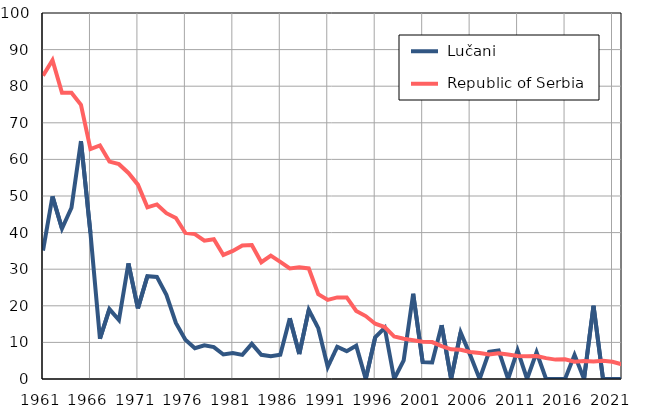
| Category |  Lučani |  Republic of Serbia |
|---|---|---|
| 1961.0 | 35.1 | 82.9 |
| 1962.0 | 49.9 | 87.1 |
| 1963.0 | 41.1 | 78.2 |
| 1964.0 | 46.8 | 78.2 |
| 1965.0 | 65 | 74.9 |
| 1966.0 | 39.9 | 62.8 |
| 1967.0 | 11 | 63.8 |
| 1968.0 | 19.1 | 59.4 |
| 1969.0 | 16.1 | 58.7 |
| 1970.0 | 31.6 | 56.3 |
| 1971.0 | 19.3 | 53.1 |
| 1972.0 | 28.1 | 46.9 |
| 1973.0 | 27.9 | 47.7 |
| 1974.0 | 23 | 45.3 |
| 1975.0 | 15.3 | 44 |
| 1976.0 | 10.7 | 39.9 |
| 1977.0 | 8.4 | 39.6 |
| 1978.0 | 9.2 | 37.8 |
| 1979.0 | 8.7 | 38.2 |
| 1980.0 | 6.7 | 33.9 |
| 1981.0 | 7.1 | 35 |
| 1982.0 | 6.6 | 36.5 |
| 1983.0 | 9.6 | 36.6 |
| 1984.0 | 6.6 | 31.9 |
| 1985.0 | 6.2 | 33.7 |
| 1986.0 | 6.6 | 32 |
| 1987.0 | 16.6 | 30.2 |
| 1988.0 | 6.8 | 30.5 |
| 1989.0 | 18.9 | 30.2 |
| 1990.0 | 13.9 | 23.2 |
| 1991.0 | 3.3 | 21.6 |
| 1992.0 | 8.8 | 22.3 |
| 1993.0 | 7.6 | 22.3 |
| 1994.0 | 9.1 | 18.6 |
| 1995.0 | 0 | 17.2 |
| 1996.0 | 11.4 | 15.1 |
| 1997.0 | 14 | 14.2 |
| 1998.0 | 0 | 11.6 |
| 1999.0 | 5.1 | 11 |
| 2000.0 | 23.3 | 10.6 |
| 2001.0 | 4.6 | 10.2 |
| 2002.0 | 4.5 | 10.1 |
| 2003.0 | 14.7 | 9 |
| 2004.0 | 0 | 8.1 |
| 2005.0 | 12.7 | 8 |
| 2006.0 | 6.6 | 7.4 |
| 2007.0 | 0 | 7.1 |
| 2008.0 | 7.4 | 6.7 |
| 2009.0 | 7.8 | 7 |
| 2010.0 | 0 | 6.7 |
| 2011.0 | 7.8 | 6.3 |
| 2012.0 | 0 | 6.2 |
| 2013.0 | 7.3 | 6.3 |
| 2014.0 | 0 | 5.7 |
| 2015.0 | 0 | 5.3 |
| 2016.0 | 0 | 5.4 |
| 2017.0 | 6.6 | 4.7 |
| 2018.0 | 0 | 4.9 |
| 2019.0 | 20 | 4.8 |
| 2020.0 | 0 | 5 |
| 2021.0 | 0 | 4.7 |
| 2022.0 | 0 | 4 |